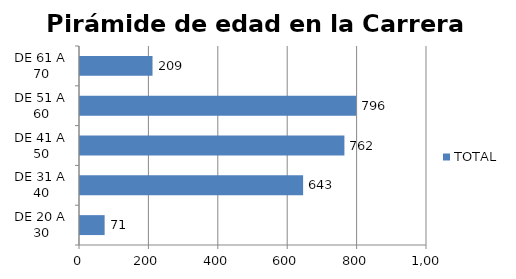
| Category | TOTAL |
|---|---|
| DE 20 A 30 | 71 |
| DE 31 A 40 | 643 |
| DE 41 A 50 | 762 |
| DE 51 A 60 | 796 |
| DE 61 A 70 | 209 |